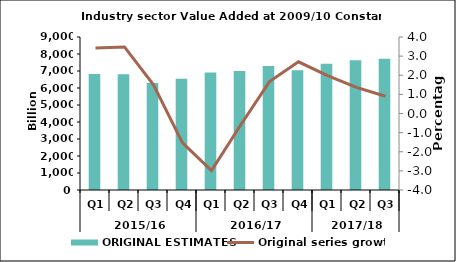
| Category | ORIGINAL ESTIMATES |
|---|---|
| 0 | 6825.927 |
| 1 | 6804.576 |
| 2 | 6301.246 |
| 3 | 6539.132 |
| 4 | 6909.155 |
| 5 | 6997.567 |
| 6 | 7300.656 |
| 7 | 7040.948 |
| 8 | 7420.379 |
| 9 | 7638.489 |
| 10 | 7713.834 |